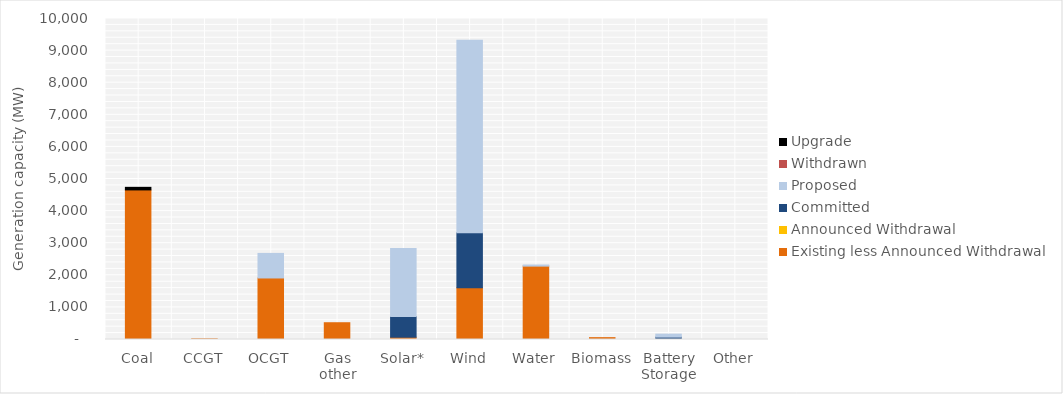
| Category | Existing less Announced Withdrawal | Announced Withdrawal | Committed | Proposed | Withdrawn | Upgrade |
|---|---|---|---|---|---|---|
| Coal | 4660 | 0 | 0 | 0 | 0 | 80 |
| CCGT | 21 | 0 | 0 | 0 | 0 | 0 |
| OCGT | 1916.8 | 0 | 0 | 765 | 0 | 0 |
| Gas other | 522.612 | 0 | 0 | 0 | 0 | 0 |
| Solar* | 71.312 | 0 | 646.75 | 2114.5 | 0 | 0 |
| Wind | 1612.9 | 0 | 1711.65 | 6001 | 0 | 0 |
| Water | 2286.237 | 0 | 0 | 34 | 0 | 0 |
| Biomass | 57.604 | 0 | 0 | 0 | 0 | 0 |
| Battery Storage | 0 | 0 | 75 | 92 | 0 | 0 |
| Other | 0 | 0 | 0 | 0 | 0 | 0 |